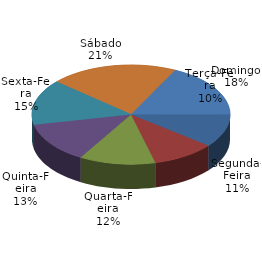
| Category | Qtde Vítimas |
|---|---|
| Segunda-Feira | 181 |
| Terça-Feira | 173 |
| Quarta-Feira | 208 |
| Quinta-Feira | 222 |
| Sexta-Feira | 248 |
| Sábado | 351 |
| Domingo | 297 |